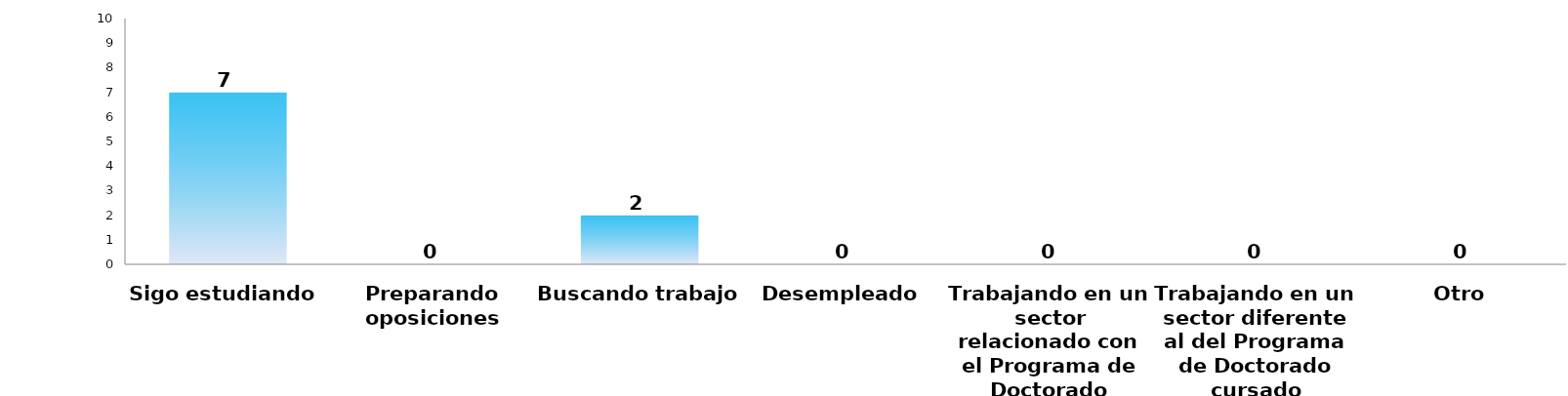
| Category | Series 0 |
|---|---|
| Sigo estudiando | 7 |
| Preparando oposiciones | 0 |
| Buscando trabajo | 2 |
| Desempleado | 0 |
| Trabajando en un sector relacionado con el Programa de Doctorado cursado | 0 |
| Trabajando en un sector diferente al del Programa de Doctorado cursado | 0 |
| Otro | 0 |